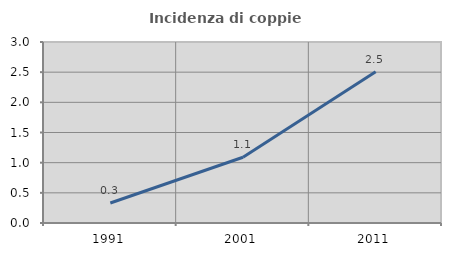
| Category | Incidenza di coppie miste |
|---|---|
| 1991.0 | 0.332 |
| 2001.0 | 1.09 |
| 2011.0 | 2.509 |